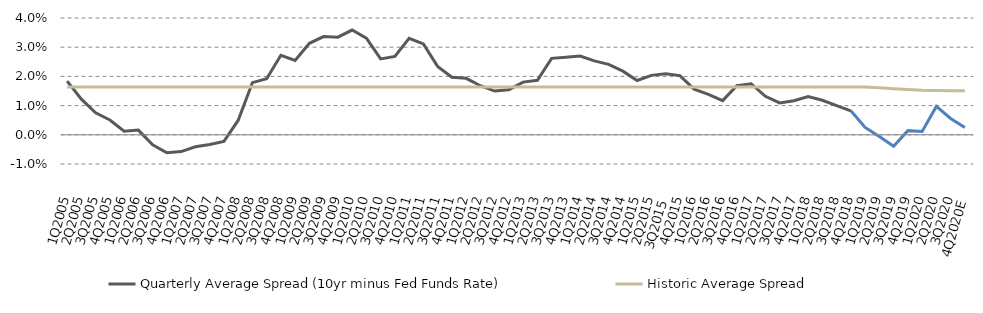
| Category | Quarterly Average Spread (10yr minus Fed Funds Rate) | Historic Average Spread |
|---|---|---|
| 4Q2020E | 0.002 | 0.015 |
| 3Q2020 | 0.006 | 0.015 |
| 2Q2020 | 0.01 | 0.015 |
| 1Q2020 | 0.001 | 0.015 |
| 4Q2019 | 0.001 | 0.016 |
| 3Q2019 | -0.004 | 0.016 |
| 2Q2019 | -0.001 | 0.016 |
| 1Q2019 | 0.003 | 0.016 |
| 4Q2018 | 0.008 | 0.016 |
| 3Q2018 | 0.01 | 0.016 |
| 2Q2018 | 0.012 | 0.016 |
| 1Q2018 | 0.013 | 0.016 |
| 4Q2017 | 0.012 | 0.016 |
| 3Q2017 | 0.011 | 0.016 |
| 2Q2017 | 0.013 | 0.016 |
| 1Q2017 | 0.017 | 0.016 |
| 4Q2016 | 0.017 | 0.016 |
| 3Q2016 | 0.012 | 0.016 |
| 2Q2016 | 0.014 | 0.016 |
| 1Q2016 | 0.016 | 0.016 |
| 4Q2015 | 0.02 | 0.016 |
| 3Q2015  | 0.021 | 0.016 |
| 2Q2015 | 0.02 | 0.016 |
| 1Q2015 | 0.019 | 0.016 |
| 4Q2014 | 0.022 | 0.016 |
| 3Q2014 | 0.024 | 0.016 |
| 2Q2014 | 0.025 | 0.016 |
| 1Q2014 | 0.027 | 0.016 |
| 4Q2013 | 0.027 | 0.016 |
| 3Q2013 | 0.026 | 0.016 |
| 2Q2013 | 0.019 | 0.016 |
| 1Q2013 | 0.018 | 0.016 |
| 4Q2012 | 0.015 | 0.016 |
| 3Q2012 | 0.015 | 0.016 |
| 2Q2012 | 0.017 | 0.016 |
| 1Q2012 | 0.019 | 0.016 |
| 4Q2011 | 0.02 | 0.016 |
| 3Q2011 | 0.023 | 0.016 |
| 2Q2011 | 0.031 | 0.016 |
| 1Q2011 | 0.033 | 0.016 |
| 4Q2010 | 0.027 | 0.016 |
| 3Q2010 | 0.026 | 0.016 |
| 2Q2010 | 0.033 | 0.016 |
| 1Q2010 | 0.036 | 0.016 |
| 4Q2009 | 0.033 | 0.016 |
| 3Q2009 | 0.034 | 0.016 |
| 2Q2009 | 0.031 | 0.016 |
| 1Q2009 | 0.025 | 0.016 |
| 4Q2008 | 0.027 | 0.016 |
| 3Q2008 | 0.019 | 0.016 |
| 2Q2008 | 0.018 | 0.016 |
| 1Q2008 | 0.005 | 0.016 |
| 4Q2007 | -0.002 | 0.016 |
| 3Q2007 | -0.003 | 0.016 |
| 2Q2007 | -0.004 | 0.016 |
| 1Q2007 | -0.006 | 0.016 |
| 4Q2006 | -0.006 | 0.016 |
| 3Q2006 | -0.003 | 0.016 |
| 2Q2006 | 0.002 | 0.016 |
| 1Q2006 | 0.001 | 0.016 |
| 4Q2005 | 0.005 | 0.016 |
| 3Q2005 | 0.008 | 0.016 |
| 2Q2005 | 0.012 | 0.016 |
| 1Q2005 | 0.018 | 0.016 |